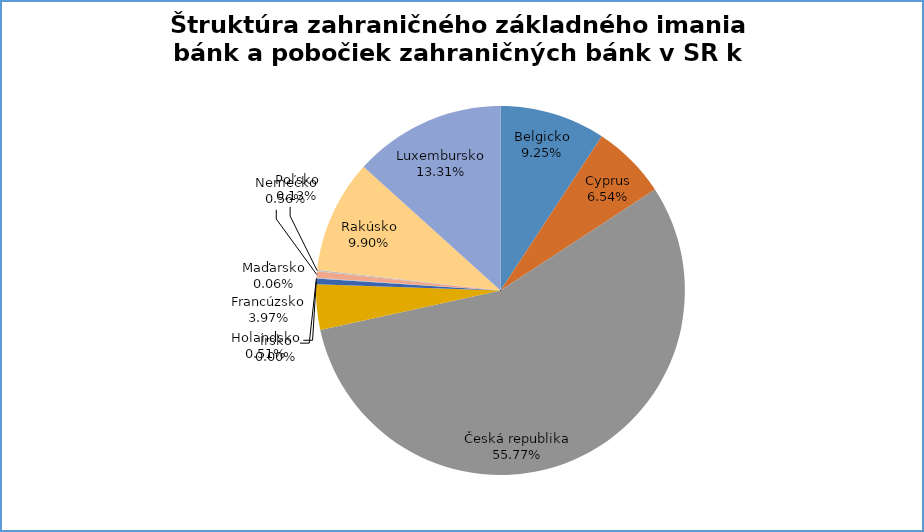
| Category | Series 0 |
|---|---|
| Belgicko | 0.093 |
| Cyprus | 0.065 |
| Česká republika | 0.558 |
| Francúzsko | 0.04 |
| Holandsko | 0.005 |
| Írsko | 0 |
| Maďarsko | 0.001 |
| Nemecko | 0.006 |
| Poľsko | 0.001 |
| Rakúsko | 0.099 |
| Luxembursko | 0.133 |